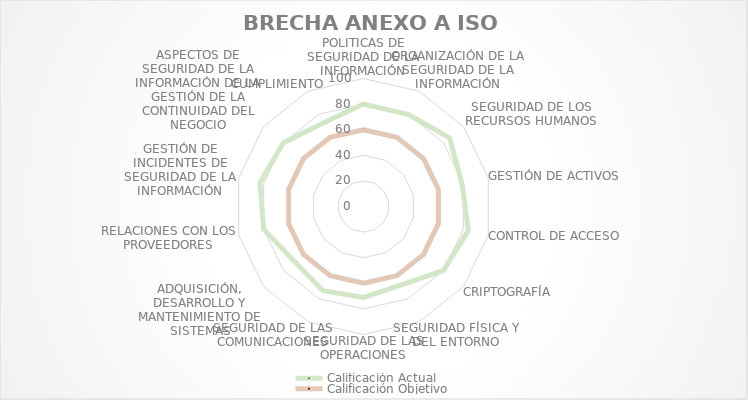
| Category | Calificación Actual | Calificación Objetivo |
|---|---|---|
| POLITICAS DE SEGURIDAD DE LA INFORMACIÓN | 80 | 60 |
| ORGANIZACIÓN DE LA SEGURIDAD DE LA INFORMACIÓN | 80 | 60 |
| SEGURIDAD DE LOS RECURSOS HUMANOS | 86 | 60 |
| GESTIÓN DE ACTIVOS | 79 | 60 |
| CONTROL DE ACCESO | 84 | 60 |
| CRIPTOGRAFÍA | 80 | 60 |
| SEGURIDAD FÍSICA Y DEL ENTORNO | 68 | 60 |
| SEGURIDAD DE LAS OPERACIONES | 71 | 60 |
| SEGURIDAD DE LAS COMUNICACIONES | 73 | 60 |
| ADQUISICIÓN, DESARROLLO Y MANTENIMIENTO DE SISTEMAS | 69 | 60 |
| RELACIONES CON LOS PROVEEDORES | 80 | 60 |
| GESTIÓN DE INCIDENTES DE SEGURIDAD DE LA INFORMACIÓN | 83 | 60 |
| ASPECTOS DE SEGURIDAD DE LA INFORMACIÓN DE LA GESTIÓN DE LA CONTINUIDAD DEL NEGOCIO | 80 | 60 |
| CUMPLIMIENTO | 72.5 | 60 |